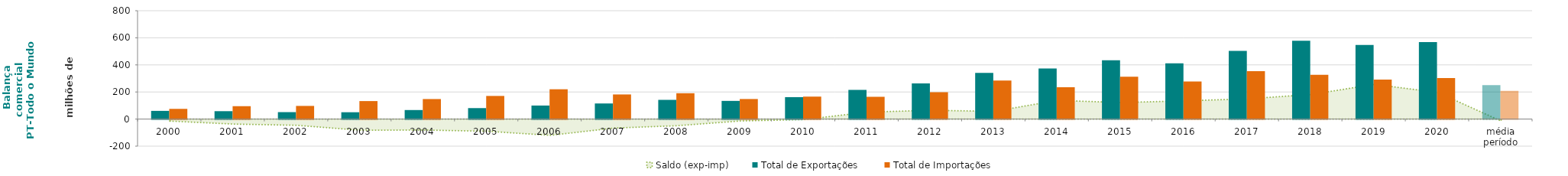
| Category | Total de Exportações  | Total de Importações  |
|---|---|---|
| 2000 | 60.474 | 75.292 |
| 2001 | 58.234 | 95.155 |
| 2002 | 51.211 | 97.136 |
| 2003 | 50.417 | 132.834 |
| 2004 | 66.729 | 147.835 |
| 2005 | 80.926 | 170.816 |
| 2006 | 99.931 | 220.039 |
| 2007 | 115.187 | 181.754 |
| 2008 | 141.826 | 190.837 |
| 2009 | 134.168 | 148.031 |
| 2010 | 161.954 | 165.794 |
| 2011 | 215.436 | 164.427 |
| 2012 | 263.032 | 198.156 |
| 2013 | 341.033 | 284.1 |
| 2014 | 372.973 | 235.023 |
| 2015 | 434.161 | 312.304 |
| 2016 | 411.746 | 277.469 |
| 2017 | 502.76 | 353.223 |
| 2018 | 578.834 | 327.015 |
| 2019 | 547.117 | 290.935 |
| 2020 | 568.489 | 302.7 |
| média período | 250.316 | 208.137 |